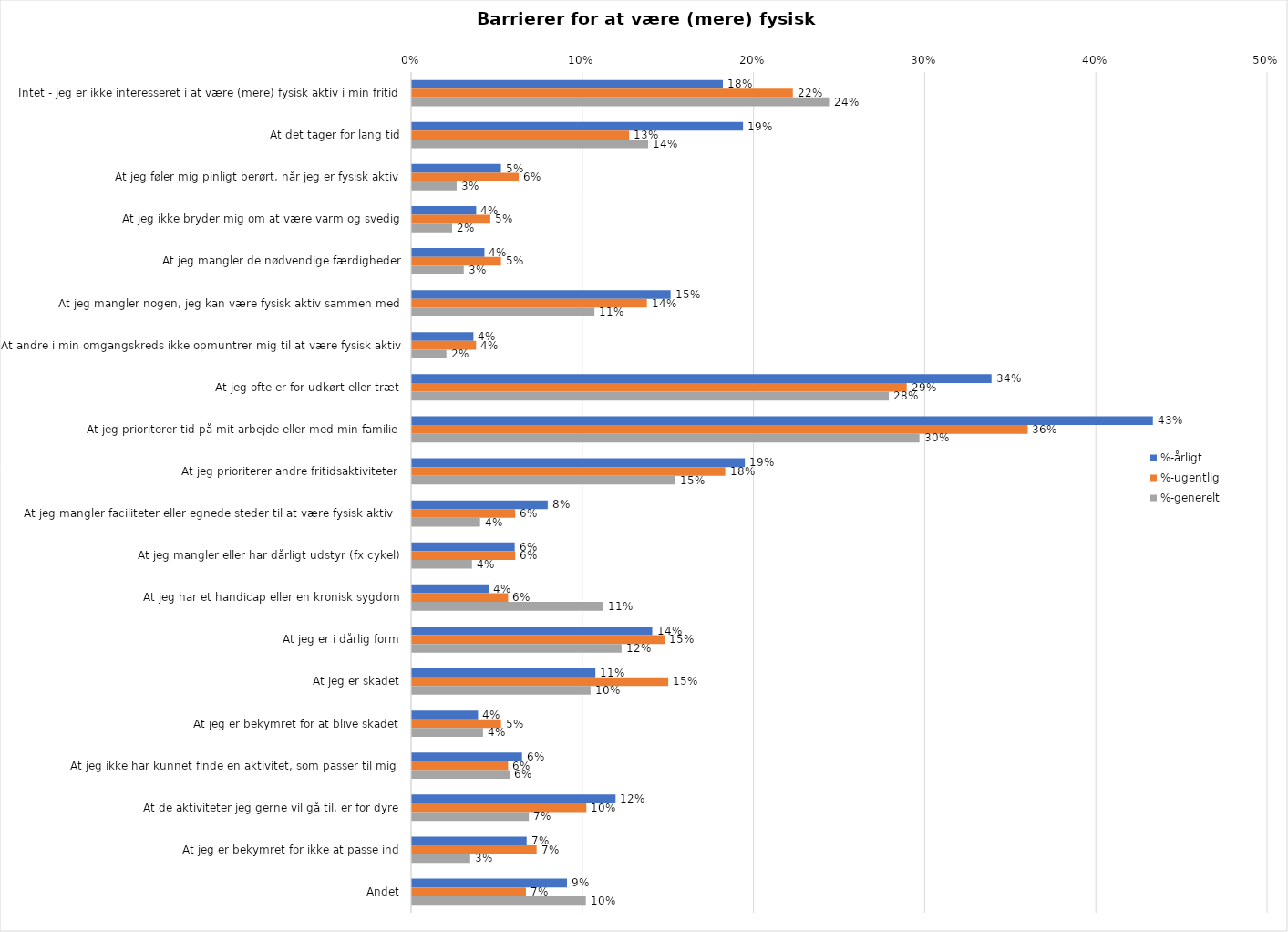
| Category | %-årligt | %-ugentlig | %-generelt |
|---|---|---|---|
| Intet - jeg er ikke interesseret i at være (mere) fysisk aktiv i min fritid | 0.182 | 0.222 | 0.244 |
| At det tager for lang tid | 0.193 | 0.127 | 0.138 |
| At jeg føler mig pinligt berørt, når jeg er fysisk aktiv | 0.052 | 0.062 | 0.026 |
| At jeg ikke bryder mig om at være varm og svedig | 0.037 | 0.046 | 0.023 |
| At jeg mangler de nødvendige færdigheder | 0.042 | 0.052 | 0.03 |
| At jeg mangler nogen, jeg kan være fysisk aktiv sammen med | 0.151 | 0.137 | 0.107 |
| At andre i min omgangskreds ikke opmuntrer mig til at være fysisk aktiv | 0.036 | 0.037 | 0.02 |
| At jeg ofte er for udkørt eller træt | 0.339 | 0.289 | 0.279 |
| At jeg prioriterer tid på mit arbejde eller med min familie | 0.433 | 0.36 | 0.296 |
| At jeg prioriterer andre fritidsaktiviteter | 0.194 | 0.183 | 0.154 |
| At jeg mangler faciliteter eller egnede steder til at være fysisk aktiv  | 0.079 | 0.06 | 0.04 |
| At jeg mangler eller har dårligt udstyr (fx cykel) | 0.06 | 0.06 | 0.035 |
| At jeg har et handicap eller en kronisk sygdom | 0.045 | 0.056 | 0.112 |
| At jeg er i dårlig form | 0.14 | 0.148 | 0.122 |
| At jeg er skadet | 0.107 | 0.15 | 0.104 |
| At jeg er bekymret for at blive skadet | 0.039 | 0.052 | 0.041 |
| At jeg ikke har kunnet finde en aktivitet, som passer til mig  | 0.064 | 0.056 | 0.057 |
| At de aktiviteter jeg gerne vil gå til, er for dyre | 0.119 | 0.102 | 0.068 |
| At jeg er bekymret for ikke at passe ind | 0.067 | 0.073 | 0.034 |
| Andet | 0.091 | 0.067 | 0.102 |